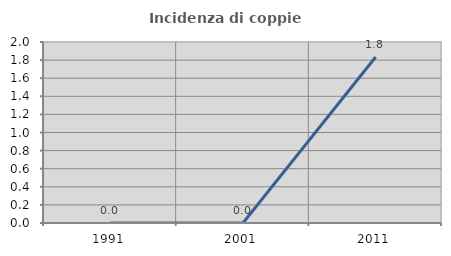
| Category | Incidenza di coppie miste |
|---|---|
| 1991.0 | 0 |
| 2001.0 | 0 |
| 2011.0 | 1.835 |